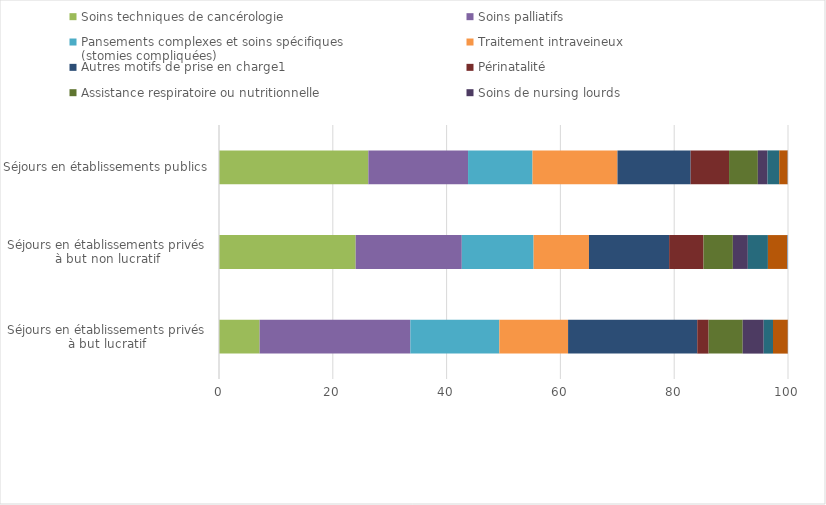
| Category | Soins techniques de cancérologie | Soins palliatifs | Pansements complexes et soins spécifiques 
(stomies compliquées) | Traitement intraveineux | Autres motifs de prise en charge1  | Périnatalité  | Assistance respiratoire ou nutritionnelle | Soins de nursing lourds | Rééducation-réadaptation-éducation  | Post-traitement chirurgical | Sortie précoce de chirurgie |
|---|---|---|---|---|---|---|---|---|---|---|---|
| Séjours en établissements privés
à but lucratif | 7.14 | 26.49 | 15.64 | 12.08 | 22.7 | 2 | 5.99 | 3.69 | 1.63 | 2.61 | 0.03 |
| Séjours en établissements privés
à but non lucratif | 24.02 | 18.65 | 12.62 | 9.73 | 14.09 | 6.04 | 5.16 | 2.63 | 3.53 | 3.41 | 0.12 |
| Séjours en établissements publics | 26.25 | 17.52 | 11.33 | 14.93 | 12.86 | 6.75 | 5.06 | 1.7 | 2.06 | 1.48 | 0.05 |